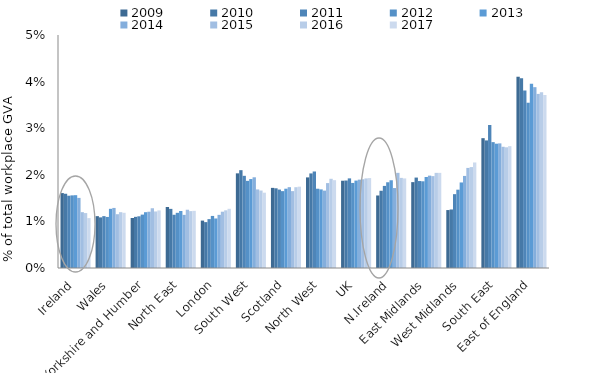
| Category | 2009 | 2010 | 2011 | 2012 | 2013 | 2014 | 2015 | 2016 | 2017 |
|---|---|---|---|---|---|---|---|---|---|
| Ireland | 0.016 | 0.016 | 0.016 | 0.016 | 0.016 | 0.015 | 0.012 | 0.012 | 0.011 |
| Wales | 0.011 | 0.011 | 0.011 | 0.011 | 0.013 | 0.013 | 0.012 | 0.012 | 0.012 |
| Yorkshire and Humber | 0.011 | 0.011 | 0.011 | 0.011 | 0.012 | 0.012 | 0.013 | 0.012 | 0.012 |
| North East | 0.013 | 0.013 | 0.011 | 0.012 | 0.012 | 0.011 | 0.013 | 0.012 | 0.012 |
| London | 0.01 | 0.01 | 0.01 | 0.011 | 0.011 | 0.011 | 0.012 | 0.012 | 0.013 |
| South West | 0.02 | 0.021 | 0.02 | 0.019 | 0.019 | 0.019 | 0.017 | 0.017 | 0.016 |
| Scotland | 0.017 | 0.017 | 0.017 | 0.016 | 0.017 | 0.017 | 0.016 | 0.017 | 0.017 |
| North West | 0.019 | 0.02 | 0.021 | 0.017 | 0.017 | 0.017 | 0.018 | 0.019 | 0.019 |
| UK | 0.019 | 0.019 | 0.019 | 0.018 | 0.019 | 0.019 | 0.019 | 0.019 | 0.019 |
| N.Ireland | 0.016 | 0.017 | 0.018 | 0.018 | 0.019 | 0.017 | 0.02 | 0.019 | 0.019 |
| East Midlands | 0.018 | 0.019 | 0.019 | 0.019 | 0.02 | 0.02 | 0.02 | 0.02 | 0.02 |
| West Midlands | 0.012 | 0.013 | 0.016 | 0.017 | 0.018 | 0.02 | 0.021 | 0.022 | 0.023 |
| South East | 0.028 | 0.027 | 0.031 | 0.027 | 0.027 | 0.027 | 0.026 | 0.026 | 0.026 |
| East of England | 0.041 | 0.041 | 0.038 | 0.035 | 0.04 | 0.039 | 0.037 | 0.038 | 0.037 |